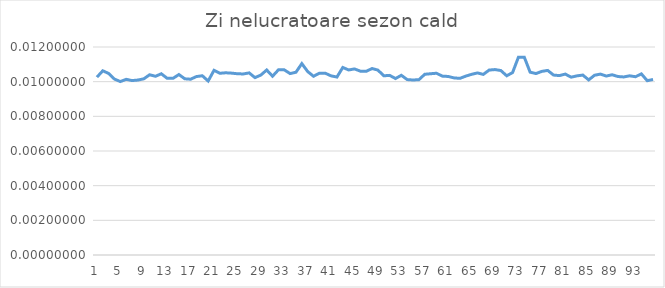
| Category | Series 0 |
|---|---|
| 0 | 0.01 |
| 1 | 0.011 |
| 2 | 0.01 |
| 3 | 0.01 |
| 4 | 0.01 |
| 5 | 0.01 |
| 6 | 0.01 |
| 7 | 0.01 |
| 8 | 0.01 |
| 9 | 0.01 |
| 10 | 0.01 |
| 11 | 0.01 |
| 12 | 0.01 |
| 13 | 0.01 |
| 14 | 0.01 |
| 15 | 0.01 |
| 16 | 0.01 |
| 17 | 0.01 |
| 18 | 0.01 |
| 19 | 0.01 |
| 20 | 0.011 |
| 21 | 0.01 |
| 22 | 0.011 |
| 23 | 0.01 |
| 24 | 0.01 |
| 25 | 0.01 |
| 26 | 0.011 |
| 27 | 0.01 |
| 28 | 0.01 |
| 29 | 0.011 |
| 30 | 0.01 |
| 31 | 0.011 |
| 32 | 0.011 |
| 33 | 0.01 |
| 34 | 0.011 |
| 35 | 0.011 |
| 36 | 0.011 |
| 37 | 0.01 |
| 38 | 0.01 |
| 39 | 0.01 |
| 40 | 0.01 |
| 41 | 0.01 |
| 42 | 0.011 |
| 43 | 0.011 |
| 44 | 0.011 |
| 45 | 0.011 |
| 46 | 0.011 |
| 47 | 0.011 |
| 48 | 0.011 |
| 49 | 0.01 |
| 50 | 0.01 |
| 51 | 0.01 |
| 52 | 0.01 |
| 53 | 0.01 |
| 54 | 0.01 |
| 55 | 0.01 |
| 56 | 0.01 |
| 57 | 0.01 |
| 58 | 0.01 |
| 59 | 0.01 |
| 60 | 0.01 |
| 61 | 0.01 |
| 62 | 0.01 |
| 63 | 0.01 |
| 64 | 0.01 |
| 65 | 0.011 |
| 66 | 0.01 |
| 67 | 0.011 |
| 68 | 0.011 |
| 69 | 0.011 |
| 70 | 0.01 |
| 71 | 0.011 |
| 72 | 0.011 |
| 73 | 0.011 |
| 74 | 0.011 |
| 75 | 0.01 |
| 76 | 0.011 |
| 77 | 0.011 |
| 78 | 0.01 |
| 79 | 0.01 |
| 80 | 0.01 |
| 81 | 0.01 |
| 82 | 0.01 |
| 83 | 0.01 |
| 84 | 0.01 |
| 85 | 0.01 |
| 86 | 0.01 |
| 87 | 0.01 |
| 88 | 0.01 |
| 89 | 0.01 |
| 90 | 0.01 |
| 91 | 0.01 |
| 92 | 0.01 |
| 93 | 0.01 |
| 94 | 0.01 |
| 95 | 0.01 |